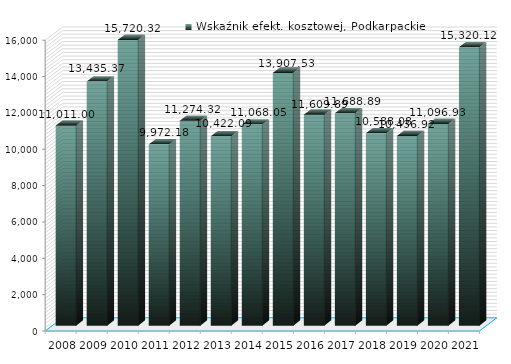
| Category | Wskaźnik efekt. kosztowej, Podkarpackie |
|---|---|
| 2008.0 | 11011 |
| 2009.0 | 13435.373 |
| 2010.0 | 15720.32 |
| 2011.0 | 9972.18 |
| 2012.0 | 11274.32 |
| 2013.0 | 10422.09 |
| 2014.0 | 11068.05 |
| 2015.0 | 13907.53 |
| 2016.0 | 11609.894 |
| 2017.0 | 11688.894 |
| 2018.0 | 10588.083 |
| 2019.0 | 10436.922 |
| 2020.0 | 11096.926 |
| 2021.0 | 15320.116 |